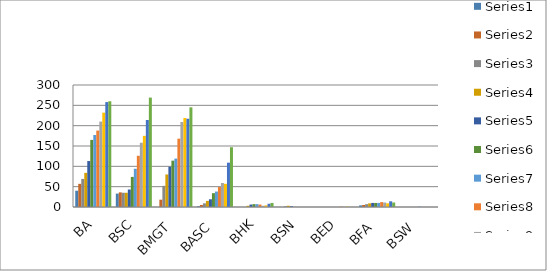
| Category | Series 0 | Series 1 | Series 2 | Series 3 | Series 4 | Series 5 | Series 6 | Series 7 | Series 8 | Series 9 | Series 10 | Series 11 |
|---|---|---|---|---|---|---|---|---|---|---|---|---|
| BA | 40 | 57 | 69 | 84 | 113 | 165 | 177 | 188 | 210 | 232 | 258 | 260 |
| BSC | 33 | 36 | 35 | 35 | 43 | 74 | 94 | 126 | 158 | 175 | 214 | 269 |
| BMGT | 0 | 18 | 52 | 80 | 99 | 114 | 119 | 168 | 209 | 219 | 217 | 245 |
| BASC | 2 | 5 | 9 | 15 | 19 | 34 | 38 | 49 | 59 | 57 | 109 | 147 |
| BHK | 0 | 0 | 0 | 3 | 6 | 7 | 7 | 6 | 3 | 4 | 8 | 10 |
| BSN | 0 | 0 | 2 | 3 | 2 | 0 | 0 | 0 | 0 | 0 | 0 | 0 |
| BED | 0 | 0 | 0 | 0 | 0 | 0 | 0 | 1 | 0 | 1 | 0 | 0 |
| BFA | 4 | 5 | 7 | 9 | 10 | 10 | 10 | 12 | 11 | 9 | 14 | 11 |
| BSW | 0 | 0 | 0 | 0 | 0 | 0 | 1 | 0 | 0 | 0 | 0 | 0 |